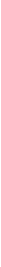
| Category | 20 listopada  2019 r.
20 November  2019 |
|---|---|
| 0.0 | 17938.5 |
| 1.0 | 17141 |
| 2.0 | 17101.5 |
| 3.0 | 17214.4 |
| 4.0 | 17193.9 |
| 5.0 | 17983.5 |
| 6.0 | 18880.7 |
| 7.0 | 21758.6 |
| 8.0 | 22898.5 |
| 9.0 | 23522.5 |
| 10.0 | 23186.2 |
| 11.0 | 23372 |
| 12.0 | 23330.4 |
| 13.0 | 23591.7 |
| 14.0 | 22970.8 |
| 15.0 | 23364.1 |
| 16.0 | 23987.2 |
| 17.0 | 24529 |
| 18.0 | 23770.3 |
| 19.0 | 23962.3 |
| 20.0 | 23272.9 |
| 21.0 | 22417.1 |
| 22.0 | 20200.1 |
| 23.0 | 19167.1 |
| 24.0 | 18275 |